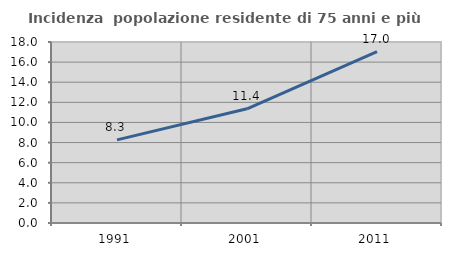
| Category | Incidenza  popolazione residente di 75 anni e più |
|---|---|
| 1991.0 | 8.263 |
| 2001.0 | 11.354 |
| 2011.0 | 17.036 |